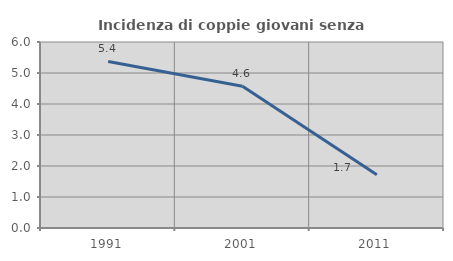
| Category | Incidenza di coppie giovani senza figli |
|---|---|
| 1991.0 | 5.373 |
| 2001.0 | 4.571 |
| 2011.0 | 1.714 |